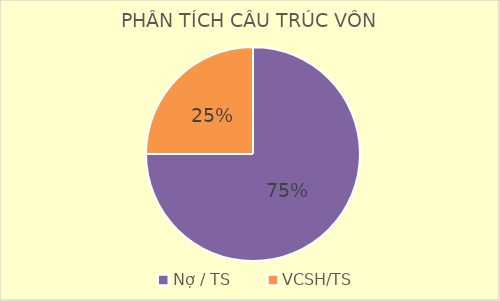
| Category | Series 0 |
|---|---|
| Nợ / TS | 0.75 |
| VCSH/TS | 0.25 |